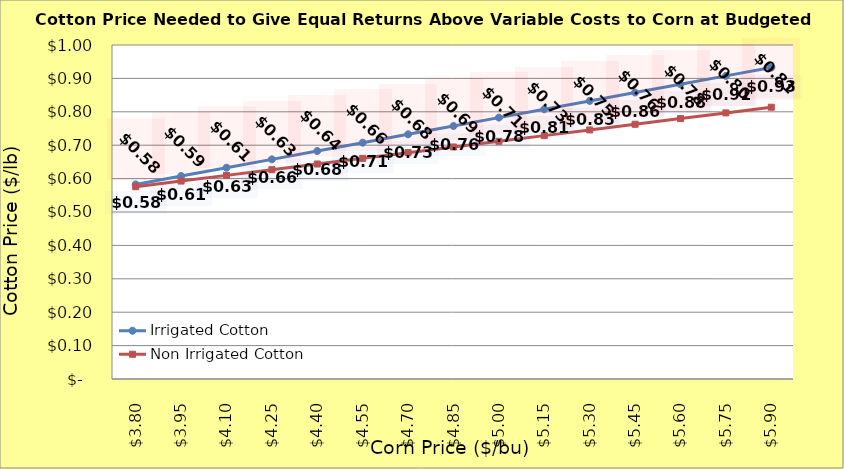
| Category | Irrigated Cotton | Non Irrigated Cotton |
|---|---|---|
| 3.799999999999998 | 0.583 | 0.576 |
| 3.949999999999998 | 0.608 | 0.593 |
| 4.099999999999998 | 0.633 | 0.61 |
| 4.249999999999998 | 0.658 | 0.627 |
| 4.399999999999999 | 0.683 | 0.644 |
| 4.549999999999999 | 0.708 | 0.661 |
| 4.699999999999999 | 0.733 | 0.678 |
| 4.85 | 0.758 | 0.695 |
| 5.0 | 0.783 | 0.712 |
| 5.15 | 0.808 | 0.729 |
| 5.300000000000001 | 0.833 | 0.746 |
| 5.450000000000001 | 0.858 | 0.763 |
| 5.600000000000001 | 0.883 | 0.78 |
| 5.750000000000002 | 0.908 | 0.797 |
| 5.900000000000002 | 0.933 | 0.814 |